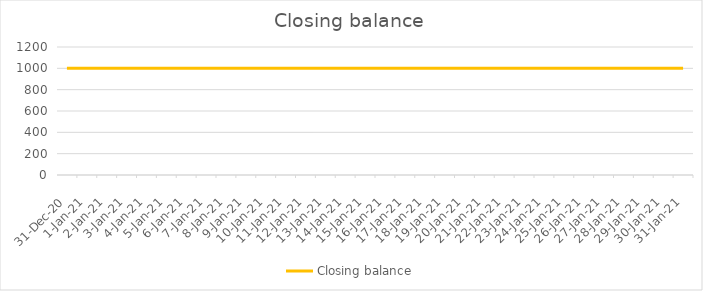
| Category | Closing balance |
|---|---|
| 2020-12-31 | 1000 |
| 2021-01-01 | 1000 |
| 2021-01-02 | 1000 |
| 2021-01-03 | 1000 |
| 2021-01-04 | 1000 |
| 2021-01-05 | 1000 |
| 2021-01-06 | 1000 |
| 2021-01-07 | 1000 |
| 2021-01-08 | 1000 |
| 2021-01-09 | 1000 |
| 2021-01-10 | 1000 |
| 2021-01-11 | 1000 |
| 2021-01-12 | 1000 |
| 2021-01-13 | 1000 |
| 2021-01-14 | 1000 |
| 2021-01-15 | 1000 |
| 2021-01-16 | 1000 |
| 2021-01-17 | 1000 |
| 2021-01-18 | 1000 |
| 2021-01-19 | 1000 |
| 2021-01-20 | 1000 |
| 2021-01-21 | 1000 |
| 2021-01-22 | 1000 |
| 2021-01-23 | 1000 |
| 2021-01-24 | 1000 |
| 2021-01-25 | 1000 |
| 2021-01-26 | 1000 |
| 2021-01-27 | 1000 |
| 2021-01-28 | 1000 |
| 2021-01-29 | 1000 |
| 2021-01-30 | 1000 |
| 2021-01-31 | 1000 |